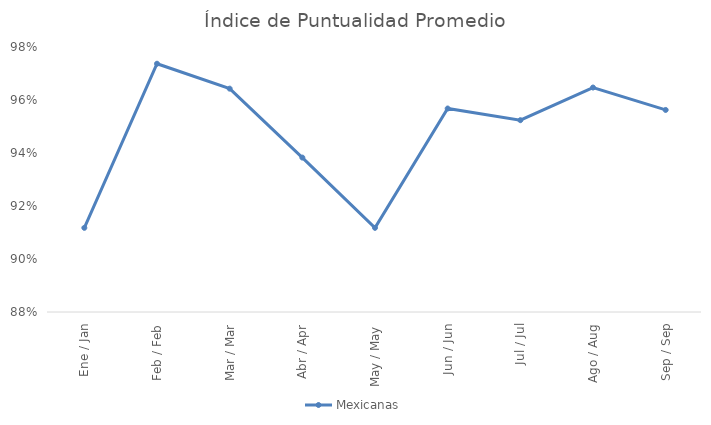
| Category | Mexicanas |
|---|---|
| Ene / Jan | 0.912 |
| Feb / Feb | 0.974 |
| Mar / Mar | 0.964 |
| Abr / Apr | 0.938 |
| May / May | 0.912 |
| Jun / Jun | 0.957 |
| Jul / Jul | 0.952 |
| Ago / Aug | 0.965 |
| Sep / Sep | 0.956 |